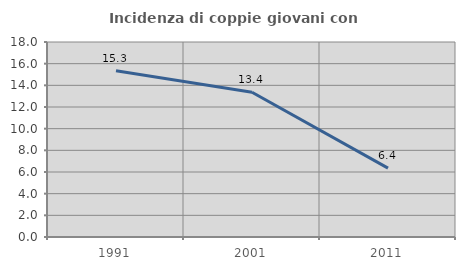
| Category | Incidenza di coppie giovani con figli |
|---|---|
| 1991.0 | 15.349 |
| 2001.0 | 13.36 |
| 2011.0 | 6.359 |